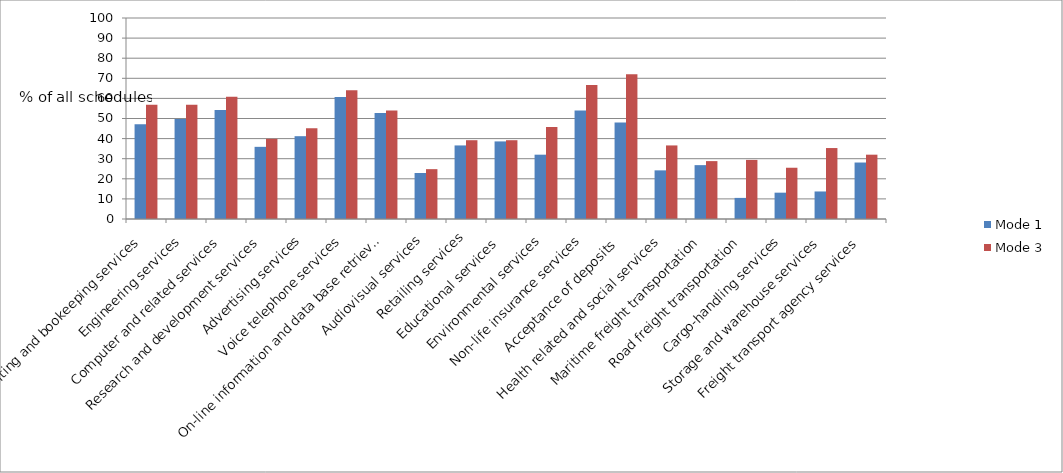
| Category | Mode 1 | Mode 3 |
|---|---|---|
| Accounting, auditing and bookeeping services | 47.1 | 56.9 |
| Engineering services | 49.7 | 56.9 |
| Computer and related services | 54.2 | 60.8 |
| Research and development services | 35.9 | 39.9 |
| Advertising services | 41.2 | 45.1 |
| Voice telephone services | 60.7 | 64 |
| On-line information and data base retrieval | 52.7 | 54 |
| Audiovisual services | 22.9 | 24.8 |
| Retailing services | 36.6 | 39.2 |
| Educational services  | 38.6 | 39.2 |
| Environmental services | 32 | 45.8 |
| Non-life insurance services | 54 | 66.7 |
| Acceptance of deposits  | 48 | 72 |
| Health related and social services | 24.2 | 36.6 |
| Maritime freight transportation | 26.8 | 28.8 |
| Road freight transportation | 10.5 | 29.4 |
| Cargo-handling services | 13.1 | 25.5 |
| Storage and warehouse services | 13.7 | 35.3 |
| Freight transport agency services | 28.1 | 32 |